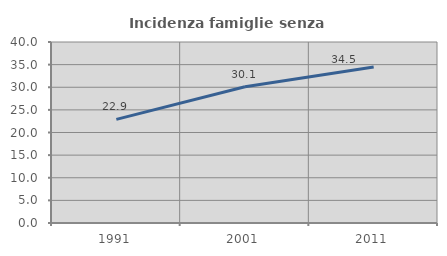
| Category | Incidenza famiglie senza nuclei |
|---|---|
| 1991.0 | 22.903 |
| 2001.0 | 30.096 |
| 2011.0 | 34.483 |